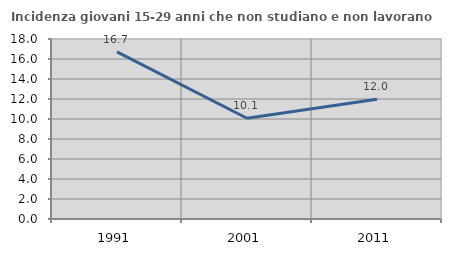
| Category | Incidenza giovani 15-29 anni che non studiano e non lavorano  |
|---|---|
| 1991.0 | 16.72 |
| 2001.0 | 10.075 |
| 2011.0 | 11.966 |